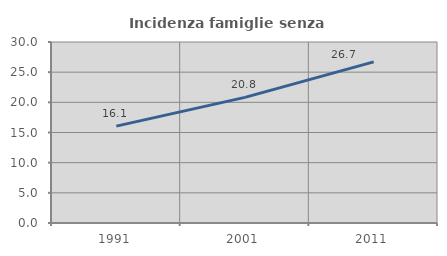
| Category | Incidenza famiglie senza nuclei |
|---|---|
| 1991.0 | 16.057 |
| 2001.0 | 20.827 |
| 2011.0 | 26.709 |